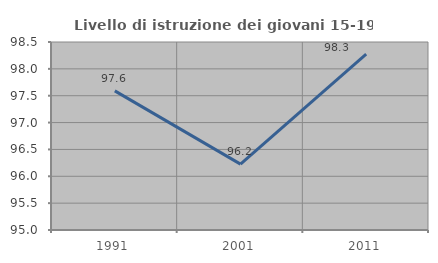
| Category | Livello di istruzione dei giovani 15-19 anni |
|---|---|
| 1991.0 | 97.59 |
| 2001.0 | 96.226 |
| 2011.0 | 98.276 |